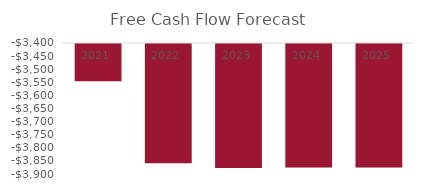
| Category | Series 0 |
|---|---|
| 2021-12-31 | -3542 |
| 2022-12-31 | -3855 |
| 2023-12-31 | -3873 |
| 2024-12-31 | -3871 |
| 2025-12-31 | -3871 |